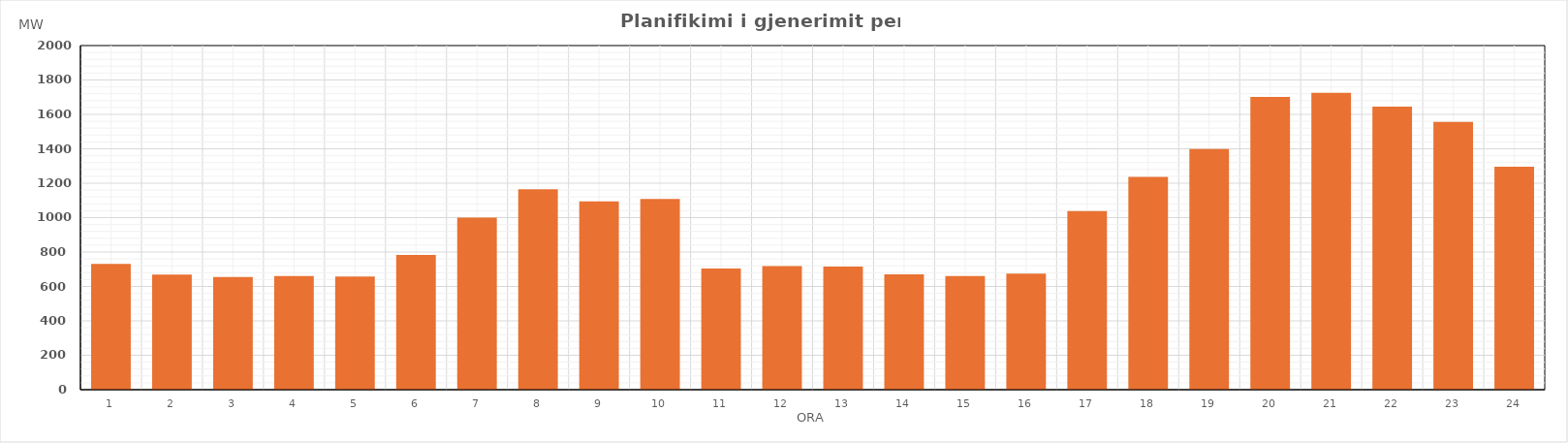
| Category | Max (MW) |
|---|---|
| 0 | 731.07 |
| 1 | 668.34 |
| 2 | 654.59 |
| 3 | 659.86 |
| 4 | 657.87 |
| 5 | 783.36 |
| 6 | 999.84 |
| 7 | 1165.2 |
| 8 | 1094.74 |
| 9 | 1108.81 |
| 10 | 704.59 |
| 11 | 717.64 |
| 12 | 716.18 |
| 13 | 670.27 |
| 14 | 660.38 |
| 15 | 674.69 |
| 16 | 1037.6 |
| 17 | 1237.01 |
| 18 | 1398.1 |
| 19 | 1702.07 |
| 20 | 1724.88 |
| 21 | 1645.48 |
| 22 | 1555.98 |
| 23 | 1296.07 |